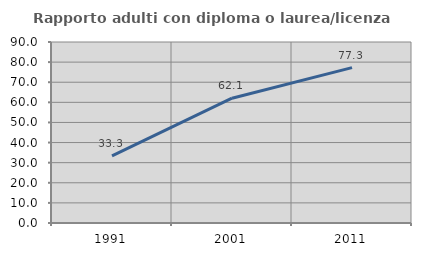
| Category | Rapporto adulti con diploma o laurea/licenza media  |
|---|---|
| 1991.0 | 33.333 |
| 2001.0 | 62.069 |
| 2011.0 | 77.273 |